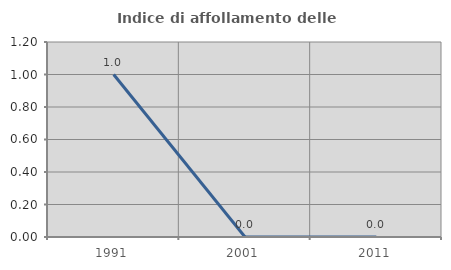
| Category | Indice di affollamento delle abitazioni  |
|---|---|
| 1991.0 | 1 |
| 2001.0 | 0 |
| 2011.0 | 0 |